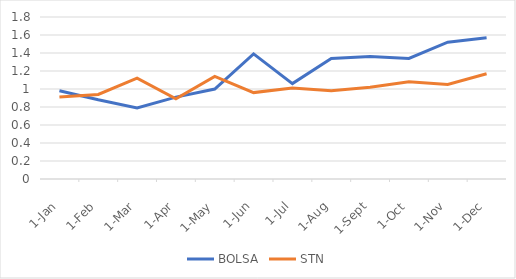
| Category | BOLSA | STN |
|---|---|---|
| 2022-01-21 | 0.98 | 0.91 |
| 2022-02-21 | 0.88 | 0.94 |
| 2022-03-21 | 0.79 | 1.12 |
| 2022-04-21 | 0.91 | 0.89 |
| 2022-05-21 | 1 | 1.14 |
| 2022-06-21 | 1.39 | 0.96 |
| 2022-07-21 | 1.06 | 1.01 |
| 2022-08-21 | 1.34 | 0.98 |
| 2022-09-21 | 1.36 | 1.02 |
| 2022-10-21 | 1.34 | 1.08 |
| 2022-11-21 | 1.52 | 1.05 |
| 2022-12-21 | 1.57 | 1.17 |